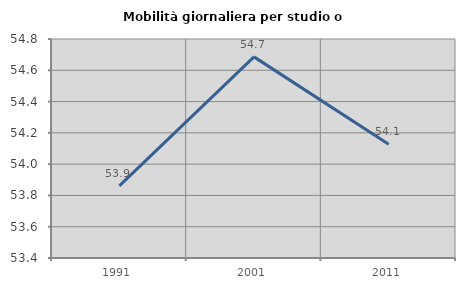
| Category | Mobilità giornaliera per studio o lavoro |
|---|---|
| 1991.0 | 53.861 |
| 2001.0 | 54.686 |
| 2011.0 | 54.127 |